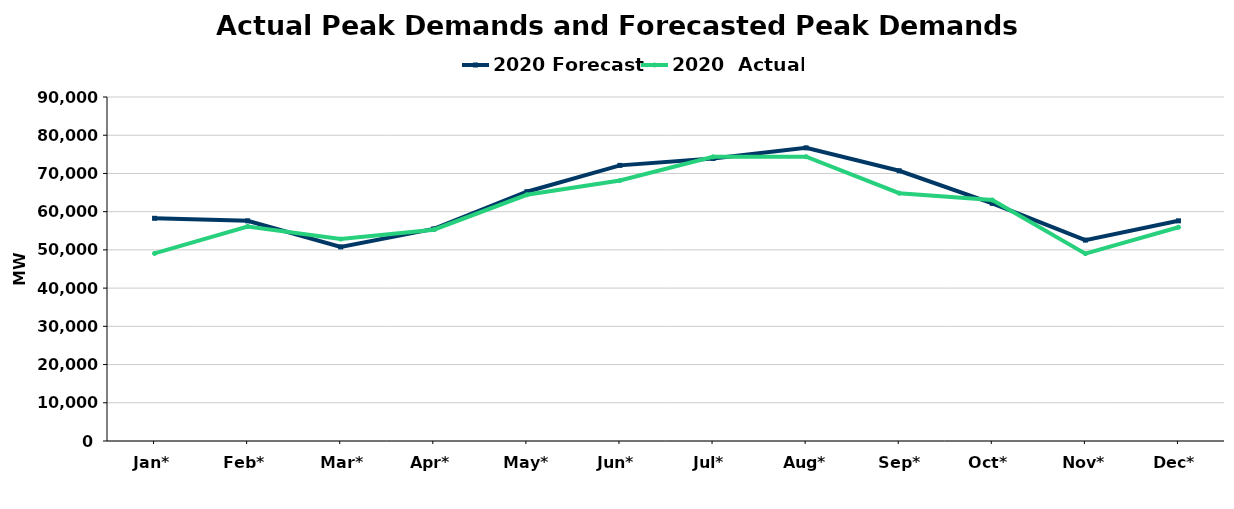
| Category | 2020 Forecast | 2020  Actual |
|---|---|---|
| Jan* | 58265 | 49072 |
| Feb* | 57599 | 56128 |
| Mar* | 50773 | 52833 |
| Apr* | 55495 | 55292 |
| May* | 65216 | 64411 |
| Jun* | 72114 | 68146 |
| Jul* | 73925 | 74344 |
| Aug* | 76696 | 74376 |
| Sep* | 70701 | 64835 |
| Oct* | 62180 | 63064 |
| Nov* | 52557 | 49020 |
| Dec* | 57604 | 55916 |